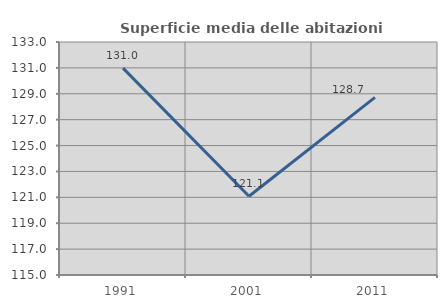
| Category | Superficie media delle abitazioni occupate |
|---|---|
| 1991.0 | 130.984 |
| 2001.0 | 121.085 |
| 2011.0 | 128.726 |